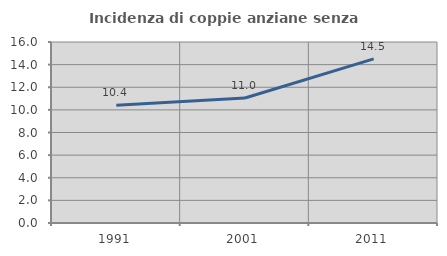
| Category | Incidenza di coppie anziane senza figli  |
|---|---|
| 1991.0 | 10.417 |
| 2001.0 | 11.045 |
| 2011.0 | 14.51 |